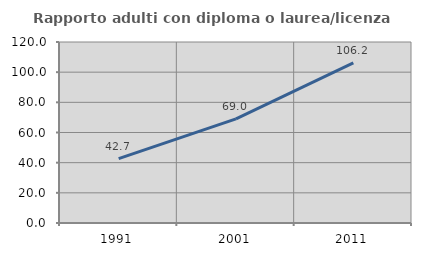
| Category | Rapporto adulti con diploma o laurea/licenza media  |
|---|---|
| 1991.0 | 42.697 |
| 2001.0 | 69.039 |
| 2011.0 | 106.181 |